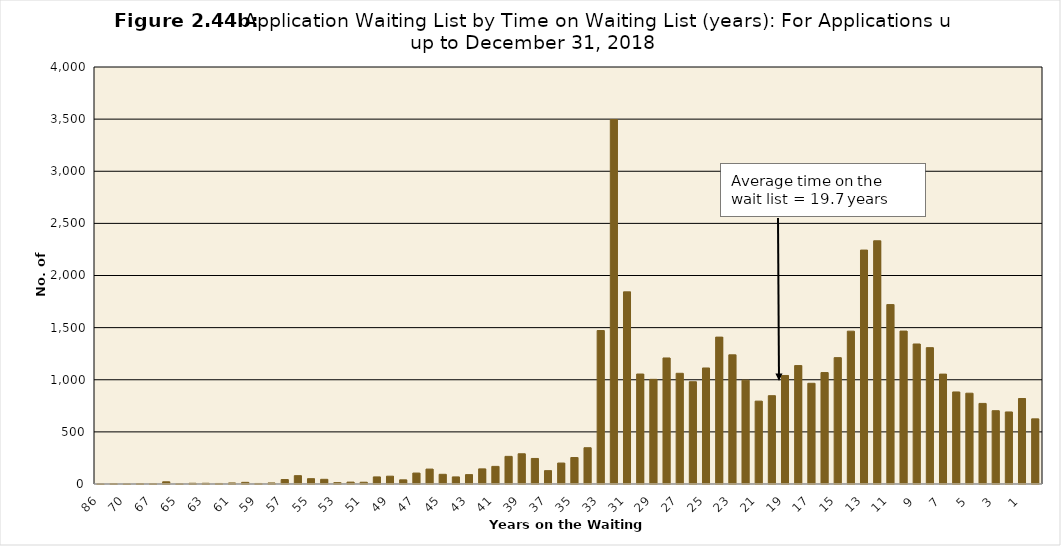
| Category | Series 0 |
|---|---|
| 86.0 | 1 |
| 71.0 | 4 |
| 70.0 | 1 |
| 68.0 | 4 |
| 67.0 | 3 |
| 66.0 | 21 |
| 65.0 | 2 |
| 64.0 | 7 |
| 63.0 | 7 |
| 62.0 | 5 |
| 61.0 | 10 |
| 60.0 | 16 |
| 59.0 | 5 |
| 58.0 | 10 |
| 57.0 | 43 |
| 56.0 | 80 |
| 55.0 | 51 |
| 54.0 | 45 |
| 53.0 | 13 |
| 52.0 | 18 |
| 51.0 | 17 |
| 50.0 | 68 |
| 49.0 | 75 |
| 48.0 | 40 |
| 47.0 | 105 |
| 46.0 | 143 |
| 45.0 | 93 |
| 44.0 | 68 |
| 43.0 | 90 |
| 42.0 | 145 |
| 41.0 | 169 |
| 40.0 | 265 |
| 39.0 | 290 |
| 38.0 | 245 |
| 37.0 | 128 |
| 36.0 | 201 |
| 35.0 | 254 |
| 34.0 | 348 |
| 33.0 | 1472 |
| 32.0 | 3496 |
| 31.0 | 1843 |
| 30.0 | 1055 |
| 29.0 | 1004 |
| 28.0 | 1209 |
| 27.0 | 1062 |
| 26.0 | 981 |
| 25.0 | 1113 |
| 24.0 | 1409 |
| 23.0 | 1239 |
| 22.0 | 996 |
| 21.0 | 795 |
| 20.0 | 847 |
| 19.0 | 1041 |
| 18.0 | 1136 |
| 17.0 | 966 |
| 16.0 | 1069 |
| 15.0 | 1212 |
| 14.0 | 1466 |
| 13.0 | 2244 |
| 12.0 | 2333 |
| 11.0 | 1721 |
| 10.0 | 1467 |
| 9.0 | 1343 |
| 8.0 | 1308 |
| 7.0 | 1054 |
| 6.0 | 883 |
| 5.0 | 871 |
| 4.0 | 773 |
| 3.0 | 703 |
| 2.0 | 691 |
| 1.0 | 820 |
| 0.0 | 625 |